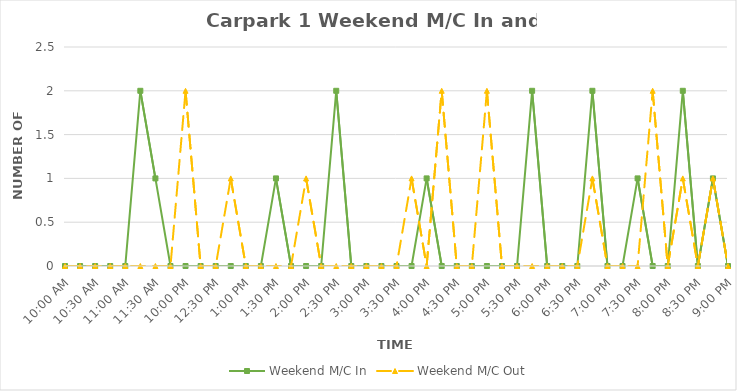
| Category | Weekend M/C In | Weekend M/C Out |
|---|---|---|
| 0.4166666666666667 | 0 | 0 |
| 0.4270833333333333 | 0 | 0 |
| 0.4375 | 0 | 0 |
| 0.4479166666666667 | 0 | 0 |
| 0.4583333333333333 | 0 | 0 |
| 0.46875 | 2 | 0 |
| 0.4791666666666667 | 1 | 0 |
| 0.4895833333333333 | 0 | 0 |
| 0.5 | 0 | 2 |
| 0.5104166666666666 | 0 | 0 |
| 0.5208333333333334 | 0 | 0 |
| 0.53125 | 0 | 1 |
| 0.5416666666666666 | 0 | 0 |
| 0.5520833333333334 | 0 | 0 |
| 0.5625 | 1 | 0 |
| 0.5729166666666666 | 0 | 0 |
| 0.5833333333333334 | 0 | 1 |
| 0.59375 | 0 | 0 |
| 0.604166666666667 | 2 | 0 |
| 0.614583333333334 | 0 | 0 |
| 0.625 | 0 | 0 |
| 0.635416666666667 | 0 | 0 |
| 0.645833333333334 | 0 | 0 |
| 0.656250000000001 | 0 | 1 |
| 0.666666666666667 | 1 | 0 |
| 0.677083333333334 | 0 | 2 |
| 0.687500000000001 | 0 | 0 |
| 0.697916666666668 | 0 | 0 |
| 0.708333333333335 | 0 | 2 |
| 0.718750000000002 | 0 | 0 |
| 0.729166666666669 | 0 | 0 |
| 0.739583333333336 | 2 | 0 |
| 0.75 | 0 | 0 |
| 0.7604166666666666 | 0 | 0 |
| 0.7708333333333334 | 0 | 0 |
| 0.78125 | 2 | 1 |
| 0.7916666666666666 | 0 | 0 |
| 0.8020833333333334 | 0 | 0 |
| 0.8125 | 1 | 0 |
| 0.8229166666666666 | 0 | 2 |
| 0.8333333333333334 | 0 | 0 |
| 0.84375 | 2 | 1 |
| 0.8541666666666666 | 0 | 0 |
| 0.8645833333333334 | 1 | 1 |
| 0.875 | 0 | 0 |